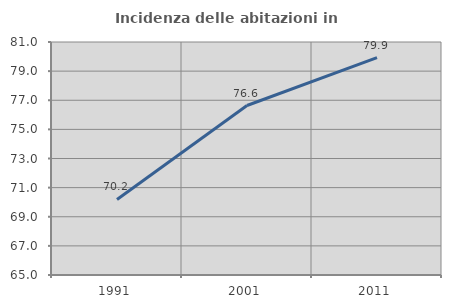
| Category | Incidenza delle abitazioni in proprietà  |
|---|---|
| 1991.0 | 70.188 |
| 2001.0 | 76.639 |
| 2011.0 | 79.932 |